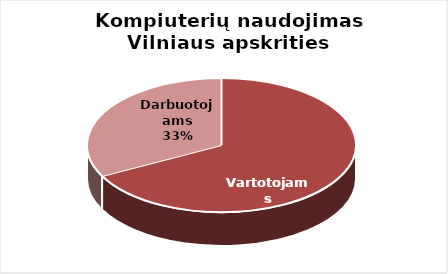
| Category | Series 0 |
|---|---|
| Vartotojams | 816 |
| Darbuotojams | 395 |